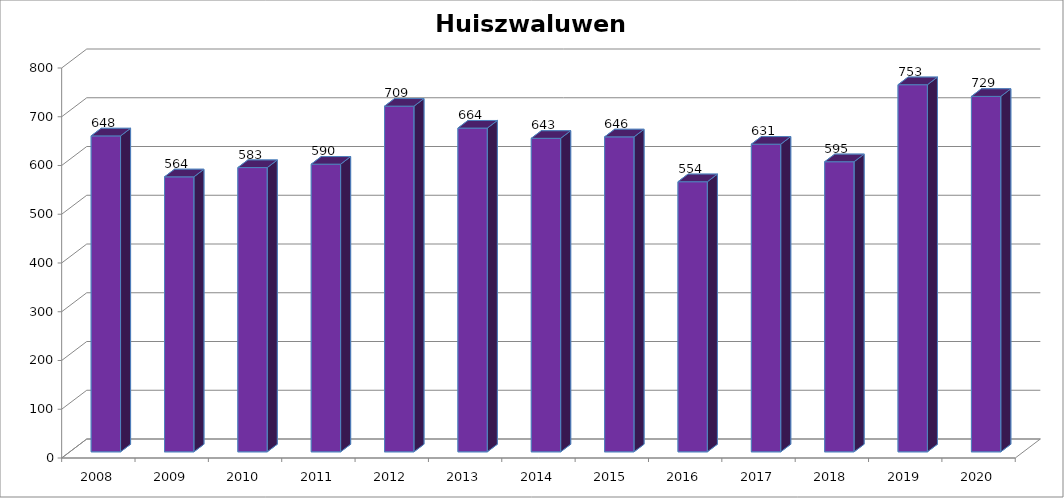
| Category | Totaal  |
|---|---|
| 2008.0 | 648 |
| 2009.0 | 564 |
| 2010.0 | 583 |
| 2011.0 | 590 |
| 2012.0 | 709 |
| 2013.0 | 664 |
| 2014.0 | 643 |
| 2015.0 | 646 |
| 2016.0 | 554 |
| 2017.0 | 631 |
| 2018.0 | 595 |
| 2019.0 | 753 |
| 2020.0 | 729 |